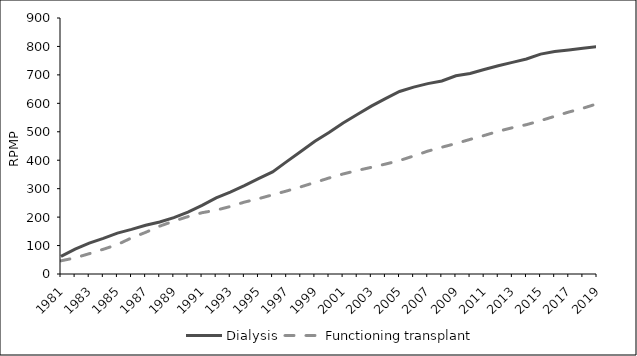
| Category | Dialysis | Functioning transplant |
|---|---|---|
| 1981 | 61.7 | 46.4 |
| 1982 | 87.7 | 56.8 |
| 1983 | 108.6 | 71.4 |
| 1984 | 125.3 | 87 |
| 1985 | 143.7 | 103.4 |
| 1986 | 157 | 127 |
| 1987 | 171.6 | 146.4 |
| 1988 | 182.7 | 168.3 |
| 1989 | 198.3 | 185.9 |
| 1990 | 217.4 | 201.7 |
| 1991 | 241.2 | 215.5 |
| 1992 | 267.6 | 224.4 |
| 1993 | 288.2 | 237.3 |
| 1994 | 310.8 | 252.7 |
| 1995 | 335 | 264.7 |
| 1996 | 358.9 | 278.4 |
| 1997 | 395 | 291.9 |
| 1998 | 430.5 | 306.4 |
| 1999 | 466.8 | 321.8 |
| 2000 | 497.3 | 337.5 |
| 2001 | 531.1 | 351.7 |
| 2002 | 560.5 | 363.9 |
| 2003 | 590.1 | 375 |
| 2004 | 616.8 | 386.4 |
| 2005 | 641.8 | 398.9 |
| 2006 | 657.1 | 414.9 |
| 2007 | 669.3 | 431.9 |
| 2008 | 678.7 | 445.7 |
| 2009 | 696.9 | 458.8 |
| 2010 | 705.2 | 473.2 |
| 2011 | 719.1 | 486.9 |
| 2012 | 732.3 | 501.9 |
| 2013 | 744.1 | 514.3 |
| 2014 | 755.8 | 525 |
| 2015 | 773.1 | 539.1 |
| 2016 | 782 | 554.4 |
| 2017 | 787.9 | 569.4 |
| 2018 | 793.7 | 582.7 |
| 2019 | 799.6 | 598.3 |